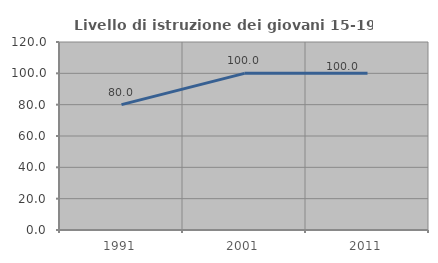
| Category | Livello di istruzione dei giovani 15-19 anni |
|---|---|
| 1991.0 | 80 |
| 2001.0 | 100 |
| 2011.0 | 100 |